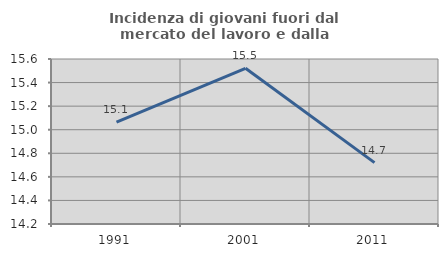
| Category | Incidenza di giovani fuori dal mercato del lavoro e dalla formazione  |
|---|---|
| 1991.0 | 15.065 |
| 2001.0 | 15.521 |
| 2011.0 | 14.721 |